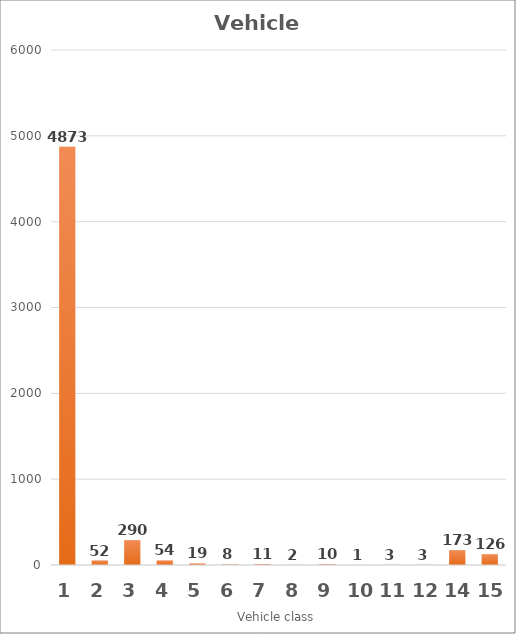
| Category | Series 0 |
|---|---|
| 1.0 | 4873 |
| 2.0 | 52 |
| 3.0 | 290 |
| 4.0 | 54 |
| 5.0 | 19 |
| 6.0 | 8 |
| 7.0 | 11 |
| 8.0 | 2 |
| 9.0 | 10 |
| 10.0 | 1 |
| 11.0 | 3 |
| 12.0 | 3 |
| 14.0 | 173 |
| 15.0 | 126 |